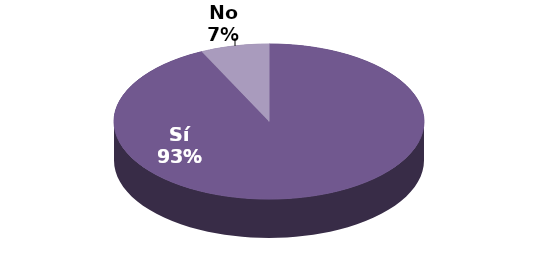
| Category | Series 1 |
|---|---|
| Sí | 13 |
| No | 1 |